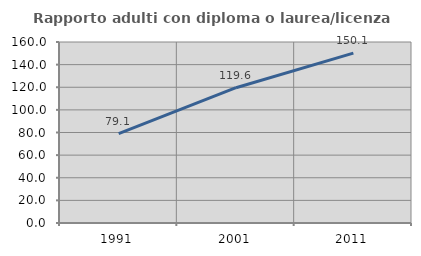
| Category | Rapporto adulti con diploma o laurea/licenza media  |
|---|---|
| 1991.0 | 79.07 |
| 2001.0 | 119.608 |
| 2011.0 | 150.117 |